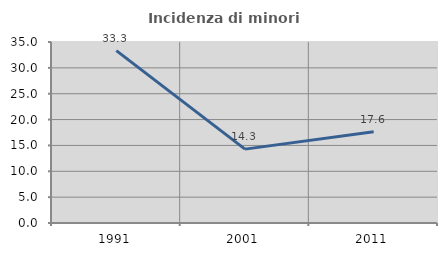
| Category | Incidenza di minori stranieri |
|---|---|
| 1991.0 | 33.333 |
| 2001.0 | 14.286 |
| 2011.0 | 17.647 |